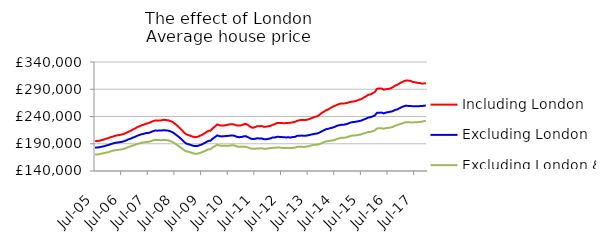
| Category | Including London | Excluding London | Excluding London & SE |
|---|---|---|---|
| 2005-07-01 | 194758.996 | 182792.088 | 170122.133 |
| 2005-08-01 | 195023.586 | 183092.965 | 170311.723 |
| 2005-09-01 | 195595.548 | 183619.092 | 171015.943 |
| 2005-10-01 | 196735.315 | 184616.157 | 172011.469 |
| 2005-11-01 | 197690.624 | 185410.575 | 172688.137 |
| 2005-12-01 | 199374.641 | 186750.229 | 173793.332 |
| 2006-01-01 | 200380.275 | 187684.42 | 174533.529 |
| 2006-02-01 | 202077.129 | 189206.617 | 175974.23 |
| 2006-03-01 | 203236.201 | 190480.674 | 177175.382 |
| 2006-04-01 | 204573.078 | 191581.008 | 178105.938 |
| 2006-05-01 | 205426.874 | 192287.375 | 178593.708 |
| 2006-06-01 | 206081.003 | 192749.94 | 179034.683 |
| 2006-07-01 | 206962.371 | 193506.686 | 179601.829 |
| 2006-08-01 | 208136.868 | 194578.54 | 180742.629 |
| 2006-09-01 | 209880.732 | 196098.179 | 182110.972 |
| 2006-10-01 | 211961.363 | 198112.853 | 184072.222 |
| 2006-11-01 | 213687.029 | 199413.291 | 185169.379 |
| 2006-12-01 | 215979.455 | 201211.467 | 186791.038 |
| 2007-01-01 | 217902.407 | 202582.948 | 187882.667 |
| 2007-02-01 | 220599.487 | 204843.176 | 189777.939 |
| 2007-03-01 | 222081.478 | 206024.734 | 190613.511 |
| 2007-04-01 | 223953.099 | 207607.418 | 191911.864 |
| 2007-05-01 | 225087.853 | 208362.472 | 192647.882 |
| 2007-06-01 | 226902.611 | 209542.225 | 193348.245 |
| 2007-07-01 | 227677.181 | 209748.012 | 193484.73 |
| 2007-08-01 | 229556.53 | 211199.006 | 194499.824 |
| 2007-09-01 | 231336.889 | 212860.707 | 196050.138 |
| 2007-10-01 | 232654.592 | 214198.05 | 197205.642 |
| 2007-11-01 | 232386.457 | 214036.994 | 196790.413 |
| 2007-12-01 | 232602.685 | 214151.394 | 196730.44 |
| 2008-01-01 | 233124.632 | 214283.3 | 196355.208 |
| 2008-02-01 | 234080.451 | 214973.779 | 197157.364 |
| 2008-03-01 | 233443.019 | 214423.6 | 196563.304 |
| 2008-04-01 | 232956.201 | 214003.951 | 196312.833 |
| 2008-05-01 | 231559.518 | 212628.955 | 194674.569 |
| 2008-06-01 | 229767.105 | 210897.684 | 193160.708 |
| 2008-07-01 | 226463.267 | 207805.464 | 190311.154 |
| 2008-08-01 | 223301.151 | 204868.589 | 187663.256 |
| 2008-09-01 | 219530.165 | 201572.05 | 184541.227 |
| 2008-10-01 | 215494.564 | 197902.375 | 181552.772 |
| 2008-11-01 | 210782.123 | 193800.308 | 178419.314 |
| 2008-12-01 | 207481.717 | 190473.793 | 176145.131 |
| 2009-01-01 | 205923.033 | 189142.544 | 175313.728 |
| 2009-02-01 | 204646.308 | 187958.892 | 174157.109 |
| 2009-03-01 | 202898.37 | 186488.541 | 172738.071 |
| 2009-04-01 | 202052.391 | 185699.718 | 171488.348 |
| 2009-05-01 | 202610.113 | 185774.416 | 171604.897 |
| 2009-06-01 | 204238.472 | 187230.901 | 172749.08 |
| 2009-07-01 | 205926.281 | 188545.278 | 174135.134 |
| 2009-08-01 | 208273.332 | 190752.042 | 175966.282 |
| 2009-09-01 | 211097.843 | 192874.855 | 177667.733 |
| 2009-10-01 | 213573.798 | 195255.293 | 179642.668 |
| 2009-11-01 | 214000.528 | 195477.913 | 179908.808 |
| 2009-12-01 | 218298.332 | 199502.881 | 183361.661 |
| 2010-01-01 | 221651.889 | 202225.668 | 185647.068 |
| 2010-02-01 | 225410.467 | 205330.592 | 188229.615 |
| 2010-03-01 | 223982.059 | 203899.961 | 186724.522 |
| 2010-04-01 | 223233.749 | 203434.648 | 186230.277 |
| 2010-05-01 | 223475.854 | 203861.691 | 186188.355 |
| 2010-06-01 | 224374.344 | 204207.585 | 186352.303 |
| 2010-07-01 | 225087.982 | 204481.659 | 186319.756 |
| 2010-08-01 | 225826.374 | 205005.014 | 186906.382 |
| 2010-09-01 | 225726.935 | 205197.428 | 187348.574 |
| 2010-10-01 | 224880.54 | 204293.135 | 186569.077 |
| 2010-11-01 | 223344.521 | 202450.019 | 184892.657 |
| 2010-12-01 | 223431.512 | 202079.4 | 184498.546 |
| 2011-01-01 | 224027.46 | 202415.381 | 184265.885 |
| 2011-02-01 | 225878.854 | 203680.66 | 184825.93 |
| 2011-03-01 | 226236.193 | 203647.902 | 184093.155 |
| 2011-04-01 | 223971.604 | 201789.464 | 183076.72 |
| 2011-05-01 | 220916.115 | 199687.264 | 181429.437 |
| 2011-06-01 | 219251.371 | 198547.407 | 180600.316 |
| 2011-07-01 | 220479.179 | 199050.989 | 180787.396 |
| 2011-08-01 | 222149.581 | 199996.505 | 181495.095 |
| 2011-09-01 | 222157.49 | 199710.556 | 181477.1 |
| 2011-10-01 | 222484.1 | 199754.192 | 181762.732 |
| 2011-11-01 | 221201.223 | 198475.187 | 180765.85 |
| 2011-12-01 | 221301.365 | 198327.774 | 180904.557 |
| 2012-01-01 | 222024.785 | 198988.625 | 181298.247 |
| 2012-02-01 | 222809.417 | 199870.174 | 182109.383 |
| 2012-03-01 | 224847.539 | 201427.06 | 182676.591 |
| 2012-04-01 | 225896.647 | 201606.535 | 182435.23 |
| 2012-05-01 | 228282.33 | 202780.819 | 183104.603 |
| 2012-06-01 | 228302.051 | 202605.496 | 183107.366 |
| 2012-07-01 | 228130.641 | 202306.631 | 182565.205 |
| 2012-08-01 | 227557.769 | 201961.27 | 182438.759 |
| 2012-09-01 | 227901.47 | 201586.846 | 182187.442 |
| 2012-10-01 | 228272.103 | 201914.578 | 182798.093 |
| 2012-11-01 | 228471.705 | 201435.934 | 182048.007 |
| 2012-12-01 | 229216.791 | 202285.782 | 182487.464 |
| 2013-01-01 | 230124.603 | 202529.705 | 182670.336 |
| 2013-02-01 | 232110.517 | 204449.827 | 184663.761 |
| 2013-03-01 | 233084.804 | 204623.943 | 184398.488 |
| 2013-04-01 | 233726.105 | 205029.156 | 184736.598 |
| 2013-05-01 | 233512.274 | 204570.087 | 183885.184 |
| 2013-06-01 | 233765.348 | 204873.045 | 184696.931 |
| 2013-07-01 | 234649.684 | 205563.102 | 185266.612 |
| 2013-08-01 | 236237.055 | 206528.49 | 186531.945 |
| 2013-09-01 | 237775.881 | 207373.419 | 187530.568 |
| 2013-10-01 | 239310.371 | 208286.364 | 188100.828 |
| 2013-11-01 | 240515.318 | 208714.711 | 188243.782 |
| 2013-12-01 | 242810.653 | 210339.961 | 189114.181 |
| 2014-01-01 | 246332.936 | 212515.24 | 190997.526 |
| 2014-02-01 | 248753.046 | 214661.694 | 192675.062 |
| 2014-03-01 | 251406.951 | 216657.4 | 194302.094 |
| 2014-04-01 | 252880.016 | 217517.071 | 194877.328 |
| 2014-05-01 | 255587.82 | 218677.952 | 195587.089 |
| 2014-06-01 | 257885.454 | 219635.936 | 196094.748 |
| 2014-07-01 | 259516.338 | 221145.772 | 197100.911 |
| 2014-08-01 | 261463.509 | 222957.434 | 198877.09 |
| 2014-09-01 | 263004.333 | 224012.937 | 199947.731 |
| 2014-10-01 | 264015.483 | 224925.821 | 201042.64 |
| 2014-11-01 | 263997.097 | 224917.499 | 200729.051 |
| 2014-12-01 | 264169.685 | 225794.76 | 201614.014 |
| 2015-01-01 | 265578.766 | 227130.654 | 202683.773 |
| 2015-02-01 | 266724.054 | 228741.722 | 204399.231 |
| 2015-03-01 | 267320.643 | 229709.743 | 205052.082 |
| 2015-04-01 | 268109.728 | 230073.883 | 205297.331 |
| 2015-05-01 | 269302.109 | 230842.839 | 205667.562 |
| 2015-06-01 | 270929.906 | 231669.865 | 206441.21 |
| 2015-07-01 | 272042.681 | 232728.534 | 207309.632 |
| 2015-08-01 | 274765.771 | 234455.758 | 209017.911 |
| 2015-09-01 | 276827.774 | 236019.904 | 210024.658 |
| 2015-10-01 | 279786.032 | 238244.49 | 211736.086 |
| 2015-11-01 | 280434.612 | 238516.45 | 211662.052 |
| 2015-12-01 | 282607.596 | 240225.959 | 213057.273 |
| 2016-01-01 | 284970.142 | 241867.366 | 214379.203 |
| 2016-02-01 | 290947.114 | 246841.744 | 218203.599 |
| 2016-03-01 | 291511.611 | 247013.845 | 218378.269 |
| 2016-04-01 | 291407.161 | 247190.812 | 218642.418 |
| 2016-05-01 | 289282.406 | 245675.514 | 217520.69 |
| 2016-06-01 | 290107.928 | 247259.005 | 218796.539 |
| 2016-07-01 | 290534.452 | 247930.925 | 219113.159 |
| 2016-08-01 | 291483.047 | 248798.126 | 219791.096 |
| 2016-09-01 | 293423.173 | 249746.202 | 220670.217 |
| 2016-10-01 | 296201.238 | 251844.475 | 222922.124 |
| 2016-11-01 | 298094.467 | 252938.315 | 223931.159 |
| 2016-12-01 | 300292.75 | 254950.311 | 225516.463 |
| 2017-01-01 | 302697.303 | 256940.877 | 226898.008 |
| 2017-02-01 | 304441.028 | 258731.074 | 228453.322 |
| 2017-03-01 | 306067.587 | 259822.33 | 229562.466 |
| 2017-04-01 | 305890.654 | 259392.863 | 229279.577 |
| 2017-05-01 | 305493.942 | 259277.762 | 229257.232 |
| 2017-06-01 | 303597.619 | 258791.85 | 229067.064 |
| 2017-07-01 | 302977.922 | 258981.534 | 229331.104 |
| 2017-08-01 | 301770.774 | 258996.236 | 229492.497 |
| 2017-09-01 | 301610.733 | 259015.958 | 229883.586 |
| 2017-10-01 | 300613.163 | 259110.754 | 230373.303 |
| 2017-11-01 | 300756.139 | 259601.804 | 231409.069 |
| 2017-12-01 | 300846.414 | 260278.71 | 232208.491 |